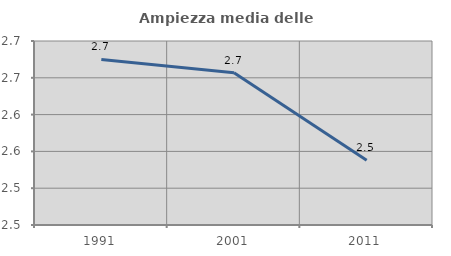
| Category | Ampiezza media delle famiglie |
|---|---|
| 1991.0 | 2.675 |
| 2001.0 | 2.657 |
| 2011.0 | 2.538 |